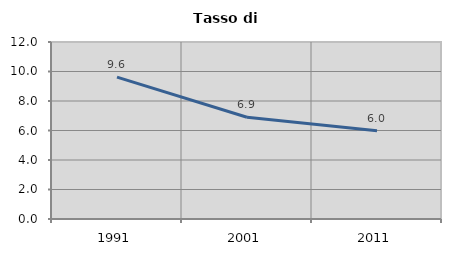
| Category | Tasso di disoccupazione   |
|---|---|
| 1991.0 | 9.615 |
| 2001.0 | 6.897 |
| 2011.0 | 5.991 |